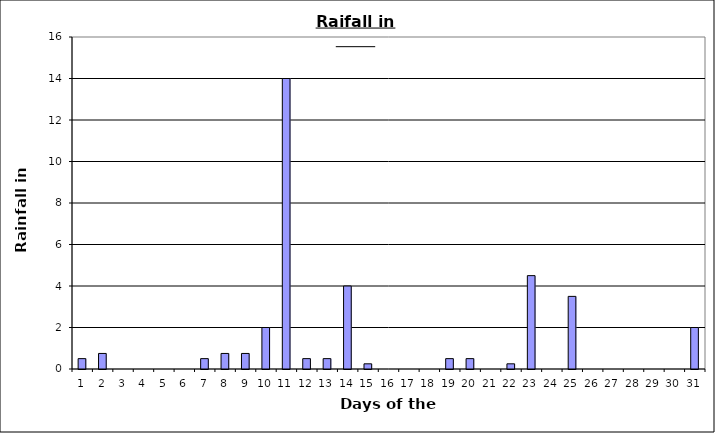
| Category | Series 0 |
|---|---|
| 0 | 0.5 |
| 1 | 0.75 |
| 2 | 0 |
| 3 | 0 |
| 4 | 0 |
| 5 | 0 |
| 6 | 0.5 |
| 7 | 0.75 |
| 8 | 0.75 |
| 9 | 2 |
| 10 | 14 |
| 11 | 0.5 |
| 12 | 0.5 |
| 13 | 4 |
| 14 | 0.25 |
| 15 | 0 |
| 16 | 0 |
| 17 | 0 |
| 18 | 0.5 |
| 19 | 0.5 |
| 20 | 0 |
| 21 | 0.25 |
| 22 | 4.5 |
| 23 | 0 |
| 24 | 3.5 |
| 25 | 0 |
| 26 | 0 |
| 27 | 0 |
| 28 | 0 |
| 29 | 0 |
| 30 | 2 |